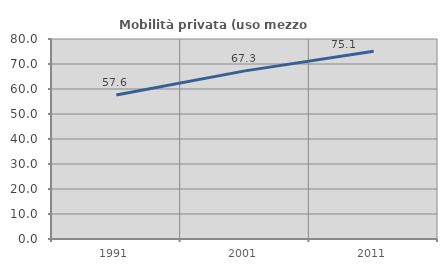
| Category | Mobilità privata (uso mezzo privato) |
|---|---|
| 1991.0 | 57.574 |
| 2001.0 | 67.253 |
| 2011.0 | 75.123 |